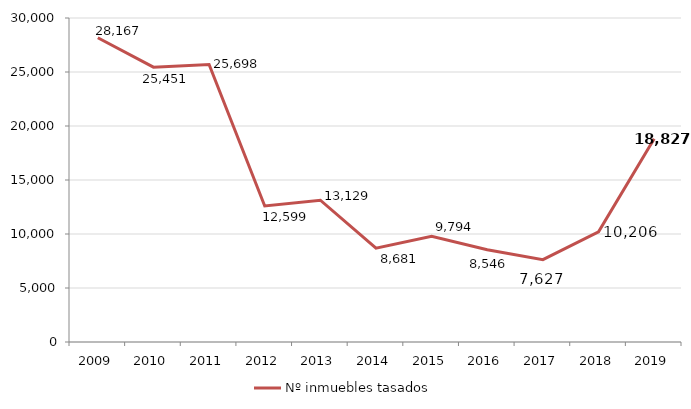
| Category | Nº inmuebles tasados |
|---|---|
| 2009.0 | 28167 |
| 2010.0 | 25451 |
| 2011.0 | 25698 |
| 2012.0 | 12599 |
| 2013.0 | 13129 |
| 2014.0 | 8681 |
| 2015.0 | 9793.5 |
| 2016.0 | 8546 |
| 2017.0 | 7627 |
| 2018.0 | 10206 |
| 2019.0 | 18827 |